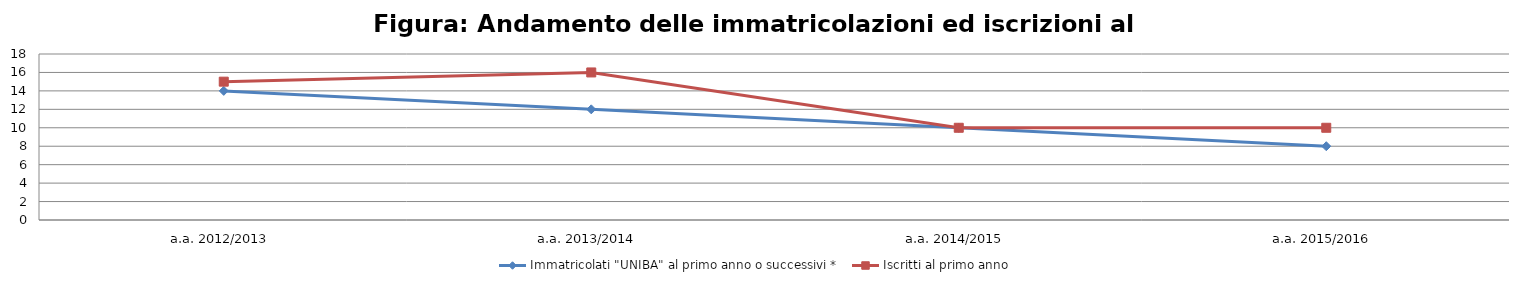
| Category | Immatricolati "UNIBA" al primo anno o successivi * | Iscritti al primo anno  |
|---|---|---|
| a.a. 2012/2013 | 14 | 15 |
| a.a. 2013/2014 | 12 | 16 |
| a.a. 2014/2015 | 10 | 10 |
| a.a. 2015/2016 | 8 | 10 |